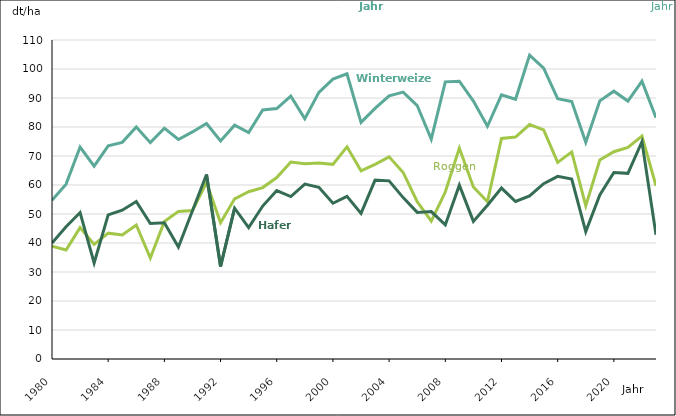
| Category | Jahr | Winterweizen | Roggen  | Hafer |
|---|---|---|---|---|
| 1980.0 | 1980 | 54.76 | 38.9 | 40 |
| 1981.0 | 1981 | 60.3 | 37.6 | 45.6 |
| 1982.0 | 1982 | 73.1 | 45.3 | 50.5 |
| 1983.0 | 1983 | 66.5 | 39.5 | 33.1 |
| 1984.0 | 1984 | 73.5 | 43.4 | 49.7 |
| 1985.0 | 1985 | 74.7 | 42.8 | 51.3 |
| 1986.0 | 1986 | 80 | 46.2 | 54.3 |
| 1987.0 | 1987 | 74.6 | 34.8 | 46.7 |
| 1988.0 | 1988 | 79.6 | 47.4 | 47 |
| 1989.0 | 1989 | 75.7 | 50.9 | 38.6 |
| 1990.0 | 1990 | 78.3 | 51.2 | 51.1 |
| 1991.0 | 1991 | 81.2 | 60.8 | 63.6 |
| 1992.0 | 1992 | 75.2 | 47 | 31.9 |
| 1993.0 | 1993 | 80.63 | 55.22 | 52.01 |
| 1994.0 | 1994 | 78.11 | 57.69 | 45.32 |
| 1995.0 | 1995 | 85.86 | 59.11 | 52.74 |
| 1996.0 | 1996 | 86.37 | 62.56 | 58.1 |
| 1997.0 | 1997 | 90.66 | 67.91 | 56.01 |
| 1998.0 | 1998 | 82.83 | 67.31 | 60.33 |
| 1999.0 | 1999 | 91.95 | 67.59 | 59.23 |
| 2000.0 | 2000 | 96.51 | 67.12 | 53.7 |
| 2001.0 | 2001 | 98.35 | 73.15 | 56.08 |
| 2002.0 | 2002 | 81.58 | 64.87 | 50.22 |
| 2003.0 | 2003 | 86.44 | 67.11 | 61.67 |
| 2004.0 | 2004 | 90.74 | 69.7 | 61.43 |
| 2005.0 | 2005 | 92.01 | 64.32 | 55.65 |
| 2006.0 | 2006 | 87.4 | 54.24 | 50.55 |
| 2007.0 | 2007 | 75.82 | 47.53 | 50.82 |
| 2008.0 | 2008 | 95.56 | 57.57 | 46.23 |
| 2009.0 | 2009 | 95.8 | 72.73 | 59.94 |
| 2010.0 | 2010 | 88.93 | 59.33 | 47.46 |
| 2011.0 | 2011 | 80.26 | 54.22 | 53.03 |
| 2012.0 | 2012 | 91.08 | 76.06 | 58.94 |
| 2013.0 | 2013 | 89.56 | 76.55 | 54.31 |
| 2014.0 | 2014 | 104.79 | 80.83 | 56.23 |
| 2015.0 | 2015 | 100.29 | 78.98 | 60.47 |
| 2016.0 | 2016 | 89.75 | 67.8 | 62.97 |
| 2017.0 | 2017 | 88.78 | 71.41 | 62.05 |
| 2018.0 | 2018 | 74.72 | 52.81 | 43.94 |
| 2019.0 | 2019 | 89.01 | 68.61 | 56.56 |
| 2020.0 | 2020 | 92.35 | 71.48 | 64.3 |
| 2021.0 | 2021 | 88.94 | 72.96 | 64.01 |
| 2022.0 | 2022 | 95.81 | 76.86 | 74.93 |
| 2023.0 | 2023 | 83.2 | 59.75 | 42.83 |